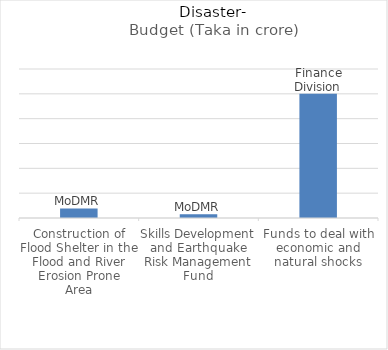
| Category | Budget (Taka in crore) |
|---|---|
| Construction of Flood Shelter in the Flood and River Erosion Prone
Area | 385 |
| Skills Development and Earthquake Risk Management
Fund | 150 |
| Funds to deal with economic and
natural shocks | 5000 |